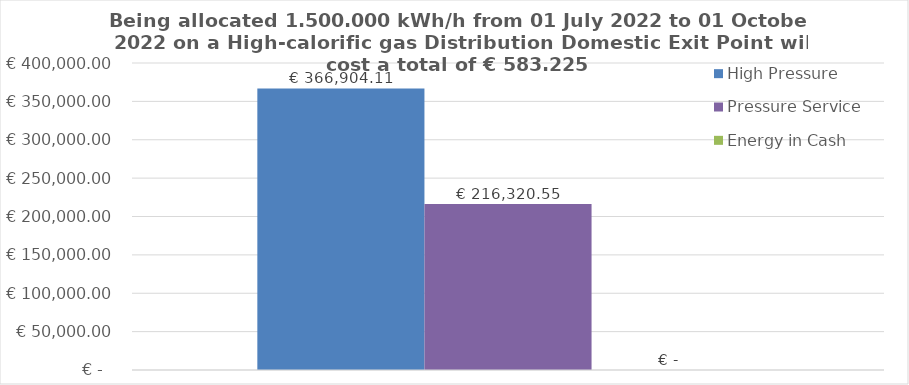
| Category | High Pressure | Pressure Service | Energy in Cash  |
|---|---|---|---|
|  | 366904.11 | 216320.548 | 0 |